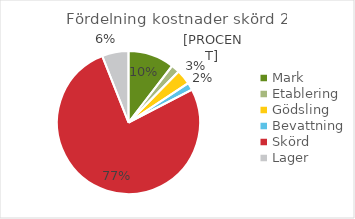
| Category | kr/kg ts |
|---|---|
| Mark | 0.216 |
| Etablering | 0.04 |
| Gödsling | 0.07 |
| Bevattning | 0.035 |
| Skörd | 1.581 |
| Lager | 0.124 |